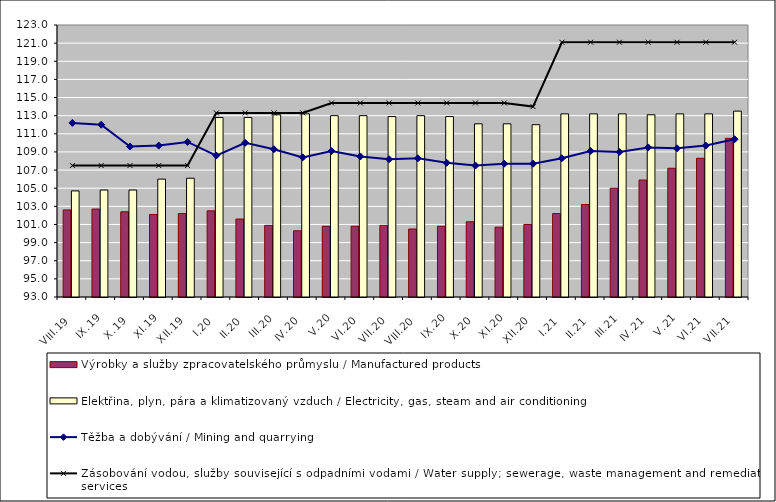
| Category | Výrobky a služby zpracovatelského průmyslu / Manufactured products | Elektřina, plyn, pára a klimatizovaný vzduch / Electricity, gas, steam and air conditioning |
|---|---|---|
| VIII.19 | 102.6 | 104.7 |
| IX.19 | 102.7 | 104.8 |
| X.19 | 102.4 | 104.8 |
| XI.19 | 102.1 | 106 |
| XII.19 | 102.2 | 106.1 |
| I.20 | 102.5 | 112.8 |
| II.20 | 101.6 | 112.8 |
| III.20 | 100.9 | 113.1 |
| IV.20 | 100.3 | 113.2 |
| V.20 | 100.8 | 113 |
| VI.20 | 100.8 | 113 |
| VII.20 | 100.9 | 112.9 |
| VIII.20 | 100.5 | 113 |
| IX.20 | 100.8 | 112.9 |
| X.20 | 101.3 | 112.1 |
| XI.20 | 100.7 | 112.1 |
| XII.20 | 101 | 112 |
| I.21 | 102.2 | 113.2 |
| II.21 | 103.2 | 113.2 |
| III.21 | 105 | 113.2 |
| IV.21 | 105.9 | 113.1 |
| V.21 | 107.2 | 113.2 |
| VI.21 | 108.3 | 113.2 |
| VII.21 | 110.5 | 113.5 |